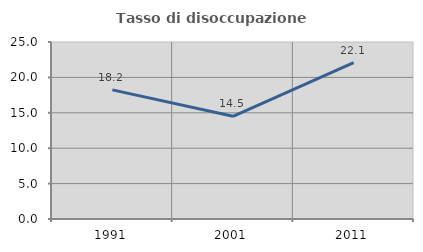
| Category | Tasso di disoccupazione giovanile  |
|---|---|
| 1991.0 | 18.239 |
| 2001.0 | 14.51 |
| 2011.0 | 22.072 |